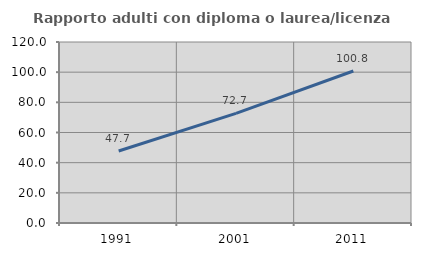
| Category | Rapporto adulti con diploma o laurea/licenza media  |
|---|---|
| 1991.0 | 47.727 |
| 2001.0 | 72.686 |
| 2011.0 | 100.791 |